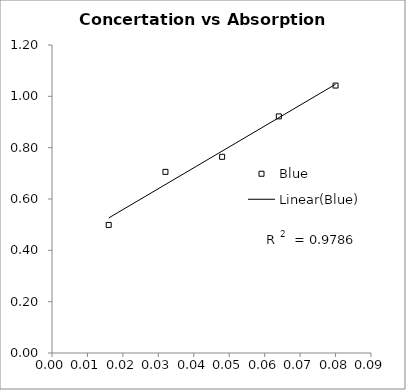
| Category | Blue |
|---|---|
| 0.016 | 0.499 |
| 0.032 | 0.706 |
| 0.048 | 0.764 |
| 0.064 | 0.922 |
| 0.08 | 1.042 |